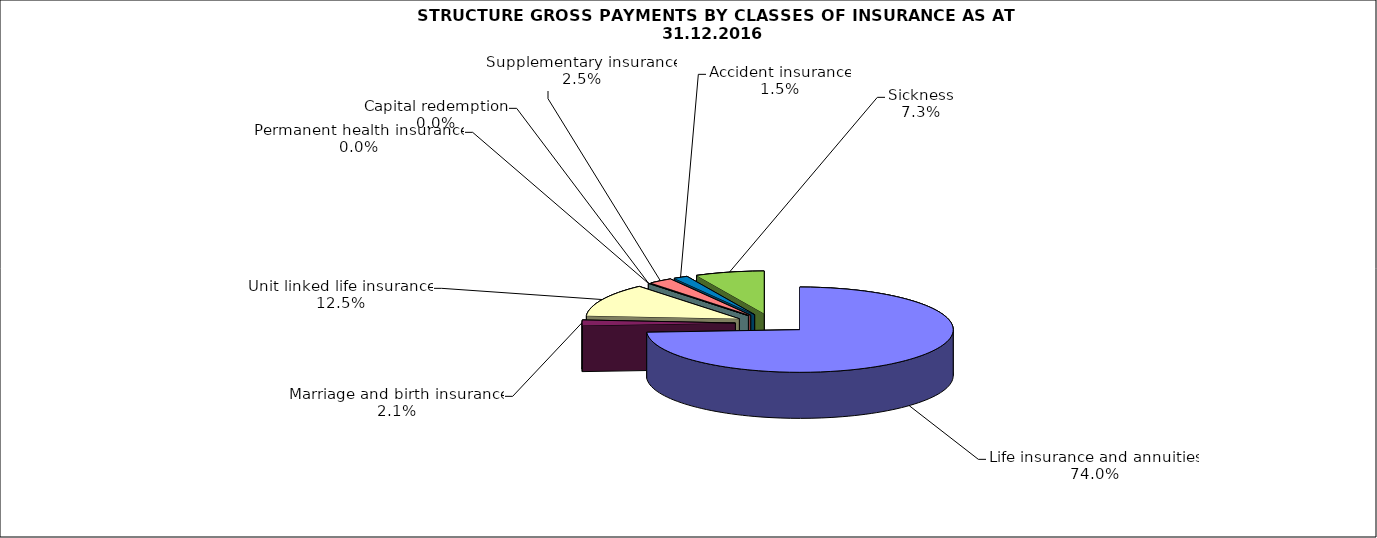
| Category | Series 0 |
|---|---|
| Life insurance and annuities | 127914510.952 |
| Marriage and birth insurance | 3635560.801 |
| Unit linked life insurance | 21668510.655 |
| Permanent health insurance | 64260.14 |
| Capital redemption | 0 |
| Supplementary insurance | 4318036.682 |
| Accident insurance | 2591961.13 |
| Sickness | 12566922.13 |